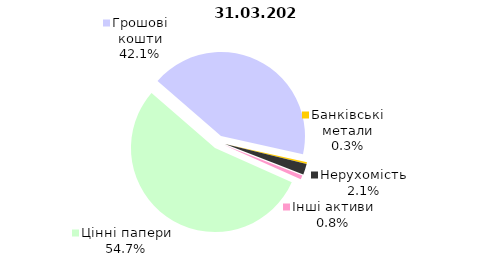
| Category | Всього |
|---|---|
| Цінні папери | 904.471 |
| Грошові кошти | 696.32 |
| Банківські метали | 5.312 |
| Нерухомість | 34.47 |
| Інші активи | 12.848 |